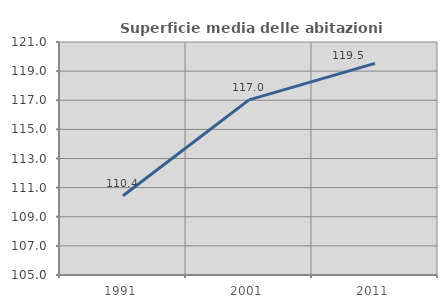
| Category | Superficie media delle abitazioni occupate |
|---|---|
| 1991.0 | 110.442 |
| 2001.0 | 117.023 |
| 2011.0 | 119.532 |